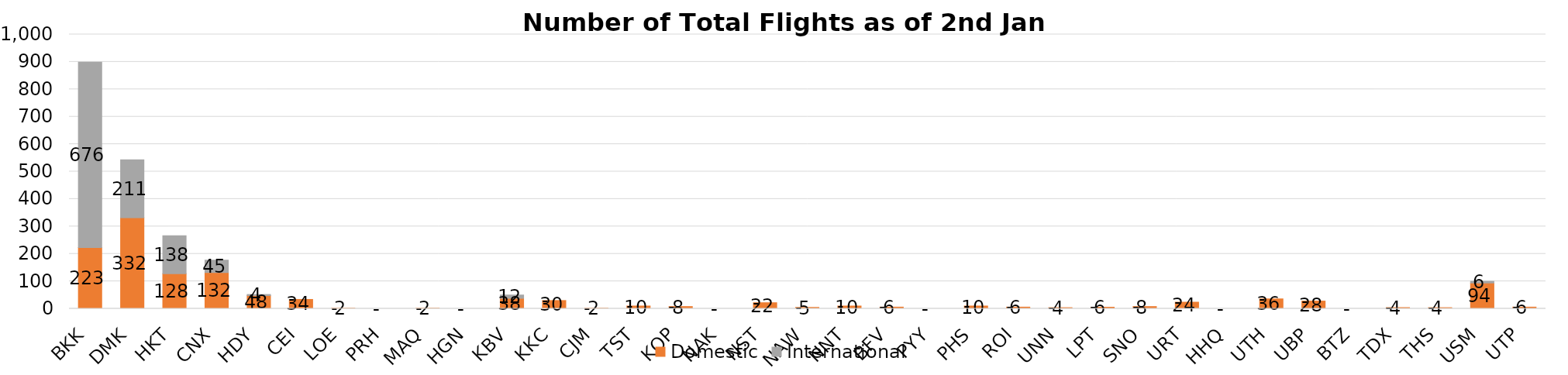
| Category | Domestic | International |
|---|---|---|
| BKK | 223 | 676 |
| DMK | 332 | 211 |
| HKT | 128 | 138 |
| CNX | 132 | 45 |
| HDY | 48 | 4 |
| CEI | 34 | 0 |
| LOE | 2 | 0 |
| PRH | 0 | 0 |
| MAQ | 2 | 0 |
| HGN | 0 | 0 |
| KBV | 38 | 12 |
| KKC | 30 | 0 |
| CJM | 2 | 0 |
| TST | 10 | 0 |
| KOP | 8 | 0 |
| NAK | 0 | 0 |
| NST | 22 | 0 |
| NAW | 5 | 0 |
| NNT | 10 | 0 |
| BFV | 6 | 0 |
| PYY | 0 | 0 |
| PHS | 10 | 0 |
| ROI | 6 | 0 |
| UNN | 4 | 0 |
| LPT | 6 | 0 |
| SNO | 8 | 0 |
| URT | 24 | 0 |
| HHQ | 0 | 0 |
| UTH | 36 | 0 |
| UBP | 28 | 0 |
| BTZ | 0 | 0 |
| TDX | 4 | 0 |
| THS | 4 | 0 |
| USM | 94 | 6 |
| UTP | 6 | 0 |